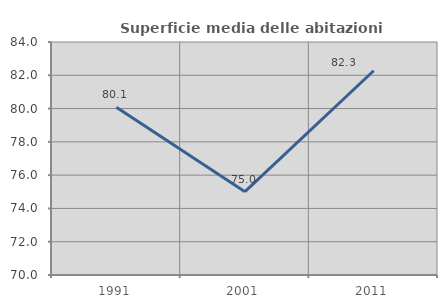
| Category | Superficie media delle abitazioni occupate |
|---|---|
| 1991.0 | 80.075 |
| 2001.0 | 75.009 |
| 2011.0 | 82.273 |